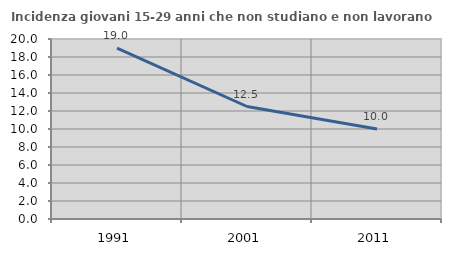
| Category | Incidenza giovani 15-29 anni che non studiano e non lavorano  |
|---|---|
| 1991.0 | 18.978 |
| 2001.0 | 12.5 |
| 2011.0 | 10 |